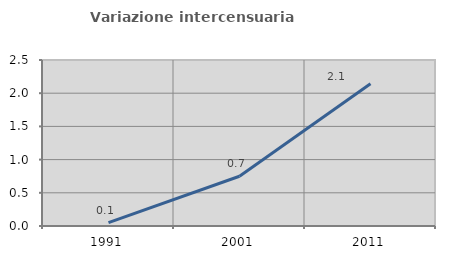
| Category | Variazione intercensuaria annua |
|---|---|
| 1991.0 | 0.05 |
| 2001.0 | 0.749 |
| 2011.0 | 2.142 |